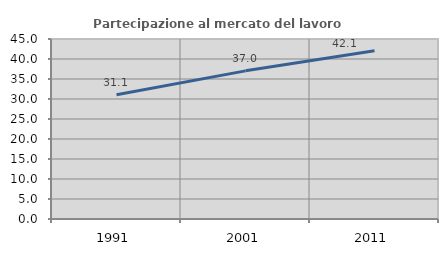
| Category | Partecipazione al mercato del lavoro  femminile |
|---|---|
| 1991.0 | 31.081 |
| 2001.0 | 37.037 |
| 2011.0 | 42.054 |